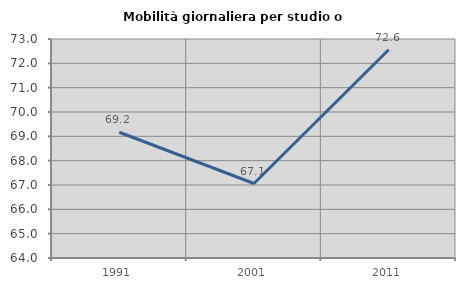
| Category | Mobilità giornaliera per studio o lavoro |
|---|---|
| 1991.0 | 69.167 |
| 2001.0 | 67.061 |
| 2011.0 | 72.556 |